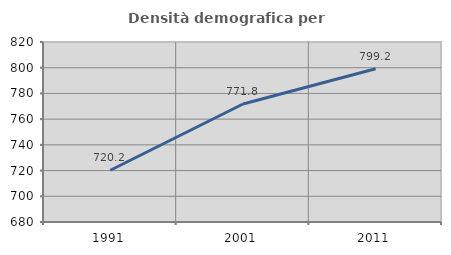
| Category | Densità demografica |
|---|---|
| 1991.0 | 720.249 |
| 2001.0 | 771.757 |
| 2011.0 | 799.227 |